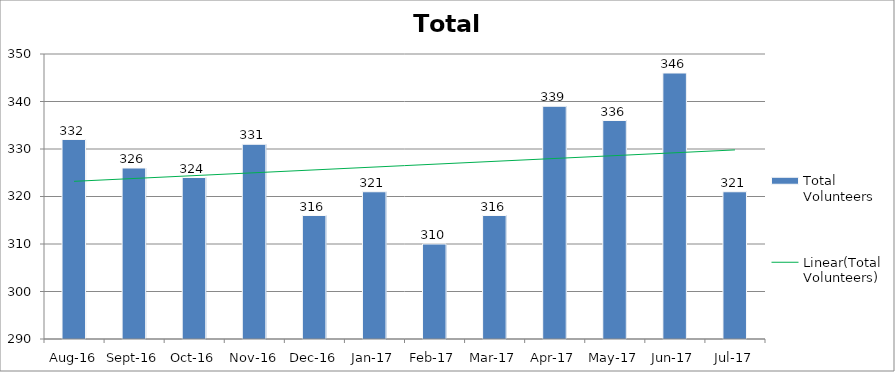
| Category | Total Volunteers |
|---|---|
| Aug-16 | 332 |
| Sep-16 | 326 |
| Oct-16 | 324 |
| Nov-16 | 331 |
| Dec-16 | 316 |
| Jan-17 | 321 |
| Feb-17 | 310 |
| Mar-17 | 316 |
| Apr-17 | 339 |
| May-17 | 336 |
| Jun-17 | 346 |
| Jul-17 | 321 |